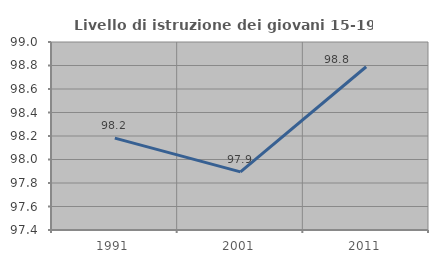
| Category | Livello di istruzione dei giovani 15-19 anni |
|---|---|
| 1991.0 | 98.182 |
| 2001.0 | 97.895 |
| 2011.0 | 98.789 |